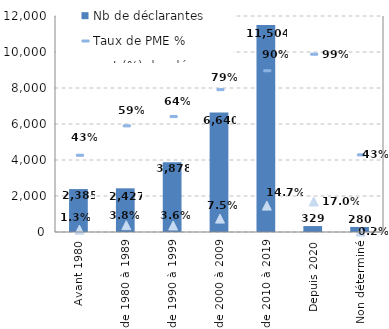
| Category | Nb de déclarantes |
|---|---|
| Avant 1980 | 2385 |
| de 1980 à 1989 | 2427 |
| de 1990 à 1999 | 3878 |
| de 2000 à 2009 | 6640 |
| de 2010 à 2019 | 11504 |
| Depuis 2020 | 329 |
| Non déterminé | 280 |